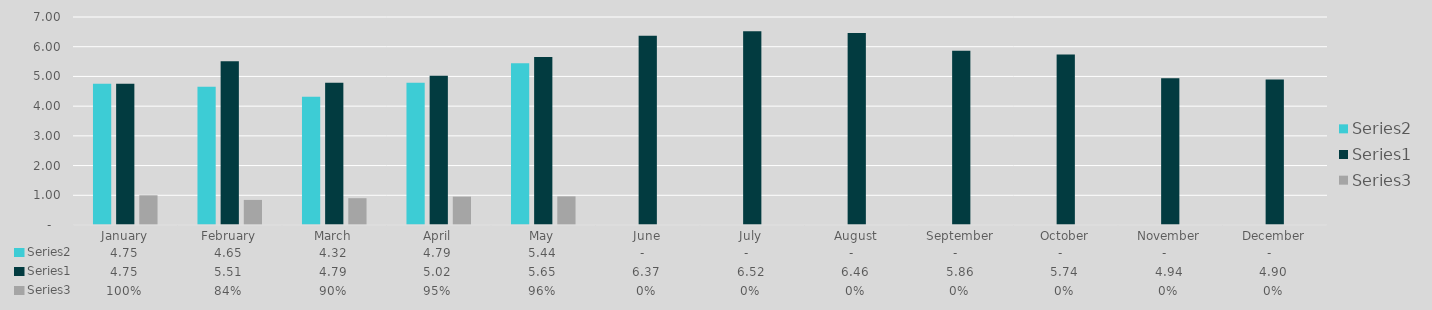
| Category | Series 1 | Series 0 | Series 2 |
|---|---|---|---|
| January | 4.75 | 4.75 | 1 |
| February | 4.65 | 5.51 | 0.844 |
| March | 4.32 | 4.79 | 0.902 |
| April | 4.79 | 5.02 | 0.954 |
| May | 5.44 | 5.65 | 0.963 |
| June | 0 | 6.37 | 0 |
| July | 0 | 6.52 | 0 |
| August | 0 | 6.46 | 0 |
| September | 0 | 5.86 | 0 |
| October | 0 | 5.74 | 0 |
| November | 0 | 4.94 | 0 |
| December | 0 | 4.9 | 0 |